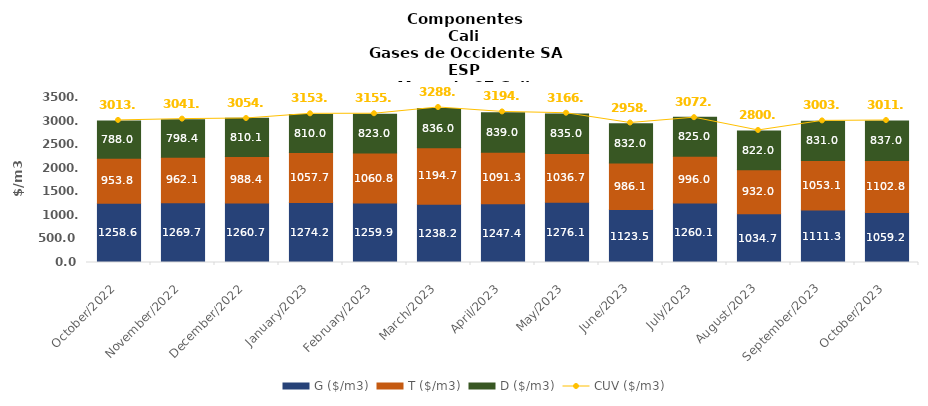
| Category | G ($/m3) | T ($/m3) | D ($/m3) |
|---|---|---|---|
| 2022-10-01 | 1258.64 | 953.77 | 787.98 |
| 2022-11-01 | 1269.65 | 962.1 | 798.39 |
| 2022-12-01 | 1260.7 | 988.43 | 810.07 |
| 2023-01-01 | 1274.19 | 1057.73 | 810 |
| 2023-02-01 | 1259.91 | 1060.8 | 823 |
| 2023-03-01 | 1238.18 | 1194.68 | 836 |
| 2023-04-01 | 1247.38 | 1091.29 | 839 |
| 2023-05-01 | 1276.06 | 1036.67 | 835 |
| 2023-06-01 | 1123.54 | 986.08 | 832 |
| 2023-07-01 | 1260.12 | 995.95 | 825 |
| 2023-08-01 | 1034.65 | 931.99 | 822 |
| 2023-09-01 | 1111.32 | 1053.08 | 831 |
| 2023-10-01 | 1059.24 | 1102.78 | 837 |